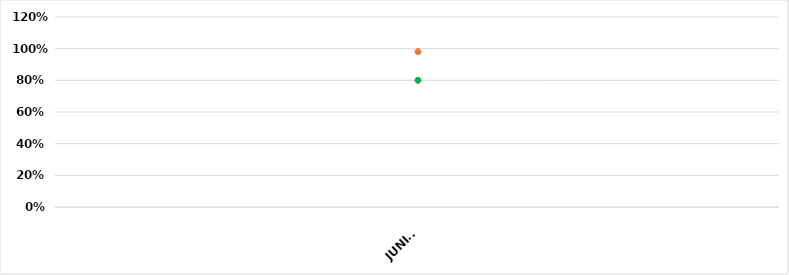
| Category | VALOR  | META PONDERADA |
|---|---|---|
| JUNIO | 0.982 | 0.8 |